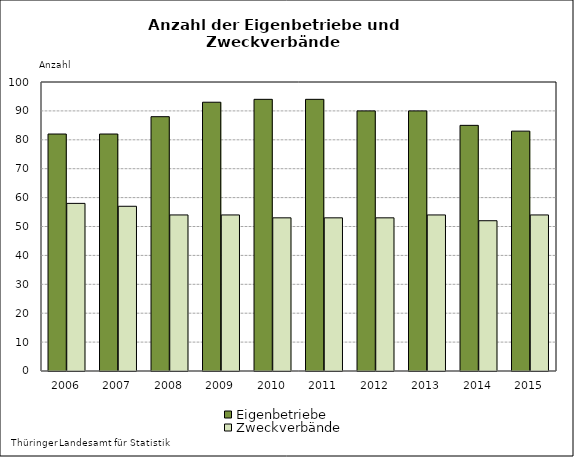
| Category | Eigenbetriebe | Zweckverbände |
|---|---|---|
| 2006.0 | 82 | 58 |
| 2007.0 | 82 | 57 |
| 2008.0 | 88 | 54 |
| 2009.0 | 93 | 54 |
| 2010.0 | 94 | 53 |
| 2011.0 | 94 | 53 |
| 2012.0 | 90 | 53 |
| 2013.0 | 90 | 54 |
| 2014.0 | 85 | 52 |
| 2015.0 | 83 | 54 |